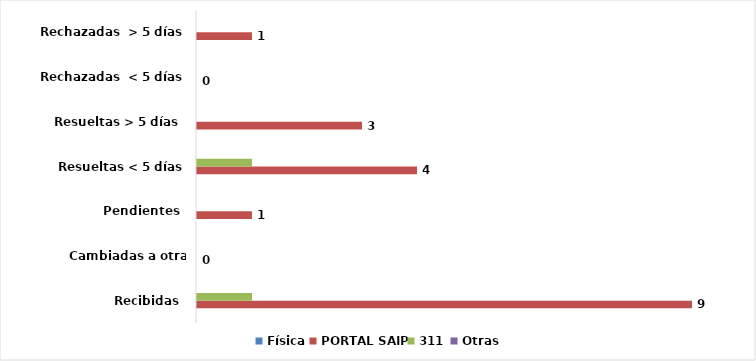
| Category | Física | PORTAL SAIP | 311 | Otras |
|---|---|---|---|---|
| Recibidas  | 0 | 9 | 1 | 0 |
| Cambiadas a otra institución | 0 | 0 | 0 | 0 |
| Pendientes  | 0 | 1 | 0 | 0 |
| Resueltas < 5 días | 0 | 4 | 1 | 0 |
| Resueltas > 5 días  | 0 | 3 | 0 | 0 |
| Rechazadas  < 5 días | 0 | 0 | 0 | 0 |
| Rechazadas  > 5 días | 0 | 1 | 0 | 0 |